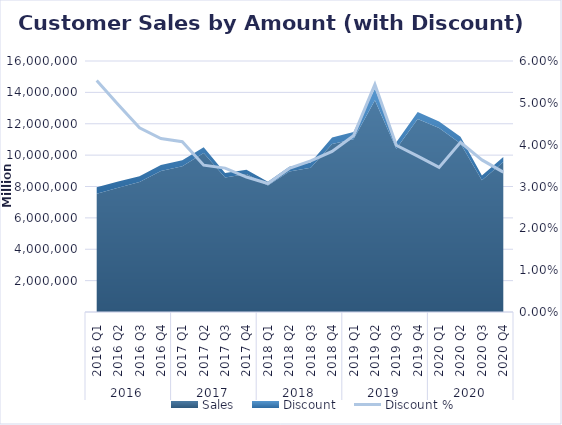
| Category | Discount % |
|---|---|
| 0 | 0.055 |
| 1 | 0.05 |
| 2 | 0.044 |
| 3 | 0.041 |
| 4 | 0.041 |
| 5 | 0.035 |
| 6 | 0.034 |
| 7 | 0.032 |
| 8 | 0.031 |
| 9 | 0.034 |
| 10 | 0.036 |
| 11 | 0.038 |
| 12 | 0.042 |
| 13 | 0.054 |
| 14 | 0.04 |
| 15 | 0.037 |
| 16 | 0.035 |
| 17 | 0.041 |
| 18 | 0.036 |
| 19 | 0.033 |